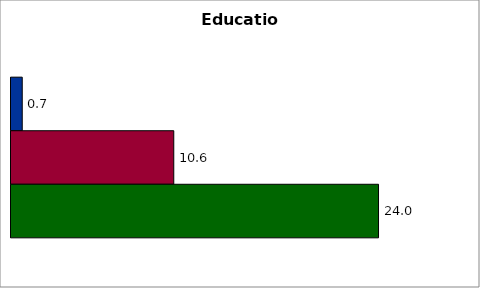
| Category | 50 states and D.C. | SREB states | State |
|---|---|---|---|
| 0 | 0.733 | 10.615 | 23.969 |